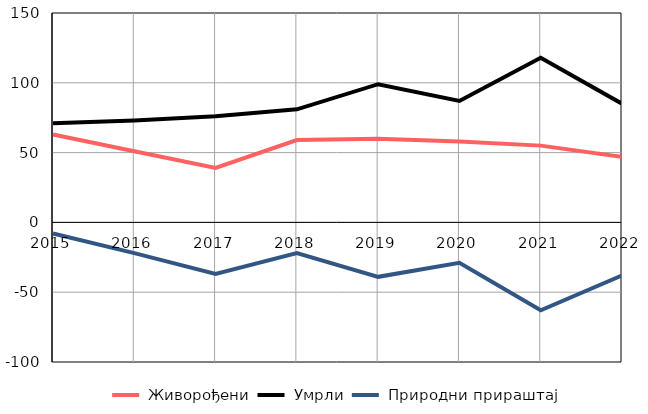
| Category |  Живорођени |  Умрли |  Природни прираштај |
|---|---|---|---|
| 2015.0 | 63 | 71 | -8 |
| 2016.0 | 51 | 73 | -22 |
| 2017.0 | 39 | 76 | -37 |
| 2018.0 | 59 | 81 | -22 |
| 2019.0 | 60 | 99 | -39 |
| 2020.0 | 58 | 87 | -29 |
| 2021.0 | 55 | 118 | -63 |
| 2022.0 | 47 | 85 | -38 |